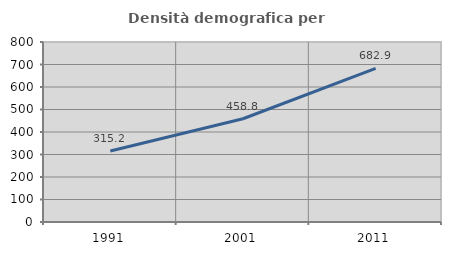
| Category | Densità demografica |
|---|---|
| 1991.0 | 315.223 |
| 2001.0 | 458.797 |
| 2011.0 | 682.931 |